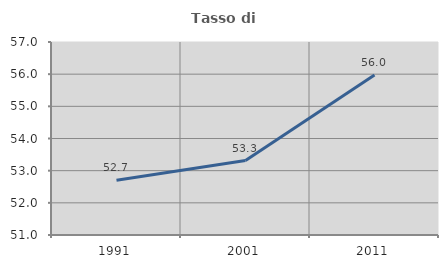
| Category | Tasso di occupazione   |
|---|---|
| 1991.0 | 52.703 |
| 2001.0 | 53.315 |
| 2011.0 | 55.973 |